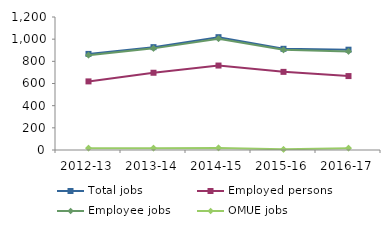
| Category | Total jobs | Employed persons | Employee jobs | OMUE jobs |
|---|---|---|---|---|
| 2012-13 | 867 | 619 | 855 | 16 |
| 2013-14 | 928 | 697 | 917 | 16 |
| 2014-15 | 1018 | 762 | 1004 | 19 |
| 2015-16 | 913 | 705 | 904 | 6 |
| 2016-17 | 905 | 667 | 889 | 16 |